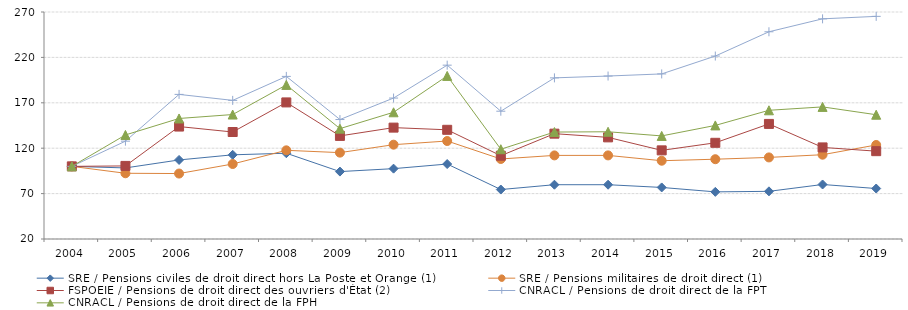
| Category | SRE / Pensions civiles de droit direct hors La Poste et Orange (1) | SRE / Pensions militaires de droit direct (1) | FSPOEIE / Pensions de droit direct des ouvriers d'État (2) | CNRACL / Pensions de droit direct de la FPT | CNRACL / Pensions de droit direct de la FPH |
|---|---|---|---|---|---|
| 2004.0 | 100 | 100 | 100 | 100 | 100 |
| 2005.0 | 98.28 | 92.393 | 100.496 | 127.752 | 134.603 |
| 2006.0 | 107.072 | 92.08 | 143.833 | 179.252 | 152.734 |
| 2007.0 | 112.71 | 102.615 | 137.83 | 172.662 | 157.071 |
| 2008.0 | 114.462 | 117.658 | 170.43 | 199.075 | 189.712 |
| 2009.0 | 94.251 | 115.119 | 133.535 | 151.573 | 141.544 |
| 2010.0 | 97.486 | 123.882 | 142.676 | 175.23 | 159.573 |
| 2011.0 | 102.557 | 127.918 | 140.253 | 211.445 | 199.606 |
| 2012.0 | 74.478 | 108.138 | 111.729 | 160.742 | 118.873 |
| 2013.0 | 79.791 | 112.069 | 136.013 | 197.457 | 137.779 |
| 2014.0 | 79.791 | 112.078 | 131.938 | 199.465 | 138.102 |
| 2015.0 | 76.784 | 106.208 | 117.621 | 201.807 | 133.524 |
| 2016.0 | 71.908 | 107.872 | 125.936 | 221.485 | 145.094 |
| 2017.0 | 72.493 | 109.848 | 146.751 | 248.226 | 161.745 |
| 2018.0 | 80.031 | 112.825 | 120.87 | 262.476 | 165.485 |
| 2019.0 | 75.594 | 123.544 | 116.74 | 265.184 | 156.868 |